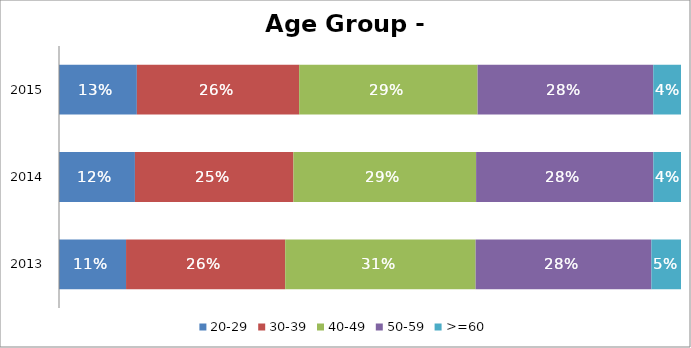
| Category | 20-29 | 30-39 | 40-49 | 50-59 | >=60 |
|---|---|---|---|---|---|
| 2013.0 | 0.108 | 0.256 | 0.306 | 0.283 | 0.048 |
| 2014.0 | 0.122 | 0.255 | 0.294 | 0.285 | 0.044 |
| 2015.0 | 0.125 | 0.261 | 0.287 | 0.282 | 0.045 |